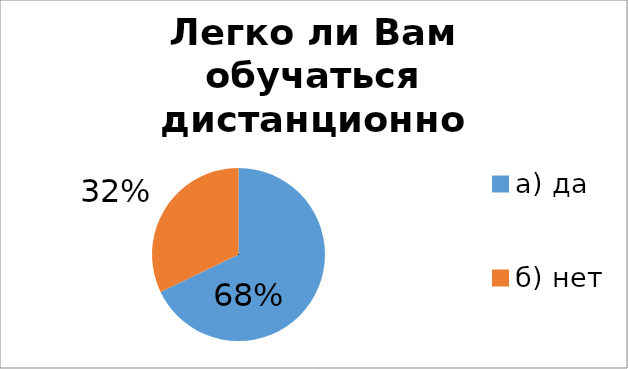
| Category | Series 0 |
|---|---|
| а) да | 67.526 |
| б) нет | 31.959 |